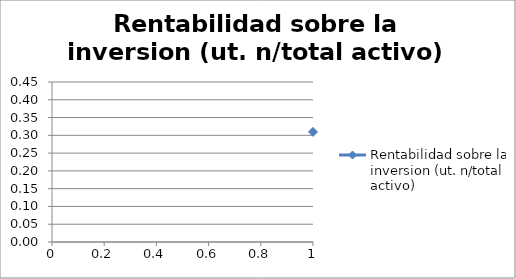
| Category | Rentabilidad sobre la inversion (ut. n/total activo) |
|---|---|
| 0 | 0.31 |
| 1 | 0.309 |
| 2 | 0.322 |
| 3 | 0.323 |
| 4 | 0.309 |
| 5 | 0.309 |
| 6 | 0.322 |
| 7 | 0.422 |